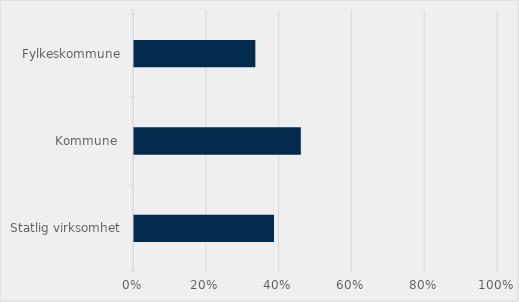
| Category | Prosent |
|---|---|
| Statlig virksomhet | 0.385 |
| Kommune  | 0.458 |
| Fylkeskommune | 0.333 |